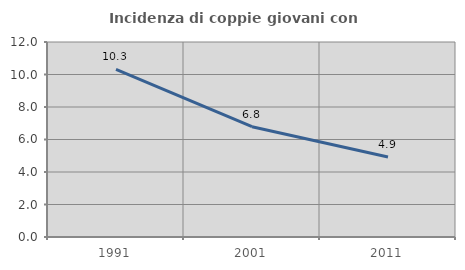
| Category | Incidenza di coppie giovani con figli |
|---|---|
| 1991.0 | 10.32 |
| 2001.0 | 6.788 |
| 2011.0 | 4.922 |